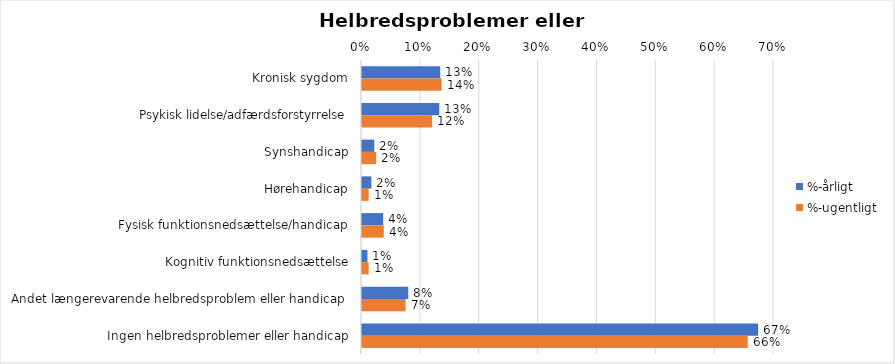
| Category | %-årligt | %-ugentligt |
|---|---|---|
| Kronisk sygdom | 0.133 | 0.135 |
| Psykisk lidelse/adfærdsforstyrrelse | 0.131 | 0.119 |
| Synshandicap | 0.021 | 0.024 |
| Hørehandicap | 0.016 | 0.011 |
| Fysisk funktionsnedsættelse/handicap | 0.036 | 0.037 |
| Kognitiv funktionsnedsættelse | 0.009 | 0.011 |
| Andet længerevarende helbredsproblem eller handicap  | 0.079 | 0.074 |
| Ingen helbredsproblemer eller handicap | 0.673 | 0.655 |